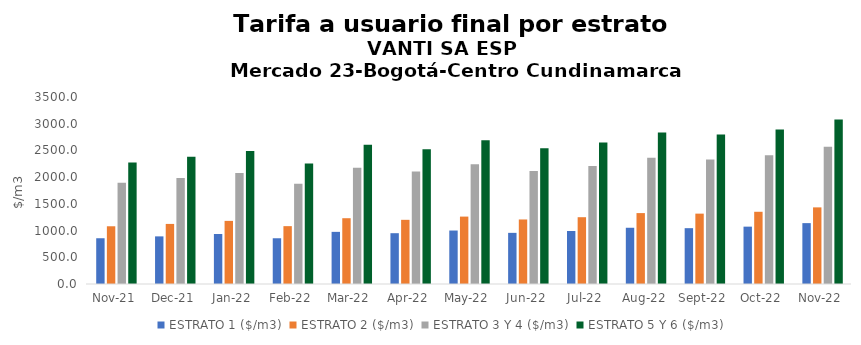
| Category | ESTRATO 1 ($/m3) | ESTRATO 2 ($/m3) | ESTRATO 3 Y 4 ($/m3) | ESTRATO 5 Y 6 ($/m3) |
|---|---|---|---|---|
| 2021-11-01 | 856.36 | 1080.57 | 1895.25 | 2274.3 |
| 2021-12-01 | 891.31 | 1124.51 | 1985.81 | 2382.972 |
| 2022-01-01 | 935.58 | 1181.34 | 2075.8 | 2490.96 |
| 2022-02-01 | 856.19 | 1082.91 | 1878.66 | 2254.392 |
| 2022-03-01 | 975.85 | 1231.21 | 2173.48 | 2608.176 |
| 2022-04-01 | 950.89 | 1201.22 | 2103.49 | 2524.188 |
| 2022-05-01 | 1000.88 | 1261.58 | 2243.11 | 2691.732 |
| 2022-06-01 | 957.2 | 1207.84 | 2116.44 | 2539.728 |
| 2022-07-01 | 991.75 | 1250.14 | 2206.55 | 2647.86 |
| 2022-08-01 | 1052.6 | 1327.26 | 2361.3 | 2833.56 |
| 2022-09-01 | 1044.96 | 1317 | 2332 | 2798.4 |
| 2022-10-01 | 1073.46 | 1351.82 | 2408.2 | 2889.84 |
| 2022-11-01 | 1139.35 | 1434.14 | 2567.61 | 3081.132 |